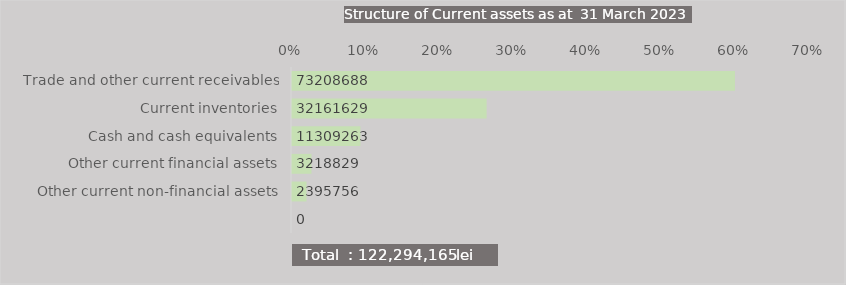
| Category | Series 0 |
|---|---|
| Trade and other current receivables | 0.599 |
| Current inventories | 0.263 |
| Cash and cash equivalents | 0.092 |
| Other current financial assets | 0.026 |
| Other current non-financial assets | 0.02 |